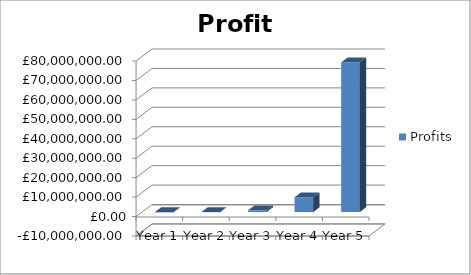
| Category | Profits |
|---|---|
| Year 1 | -220530 |
| Year 2 | -105645.888 |
| Year 3 | 897571.707 |
| Year 4 | 7630484 |
| Year 5 | 77023870 |